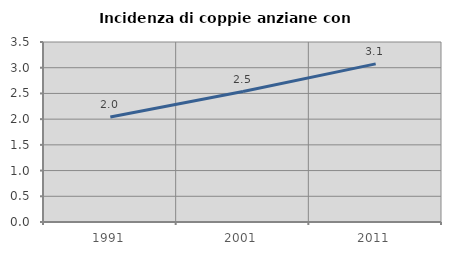
| Category | Incidenza di coppie anziane con figli |
|---|---|
| 1991.0 | 2.041 |
| 2001.0 | 2.537 |
| 2011.0 | 3.075 |